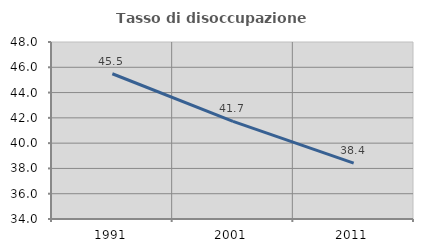
| Category | Tasso di disoccupazione giovanile  |
|---|---|
| 1991.0 | 45.489 |
| 2001.0 | 41.716 |
| 2011.0 | 38.413 |